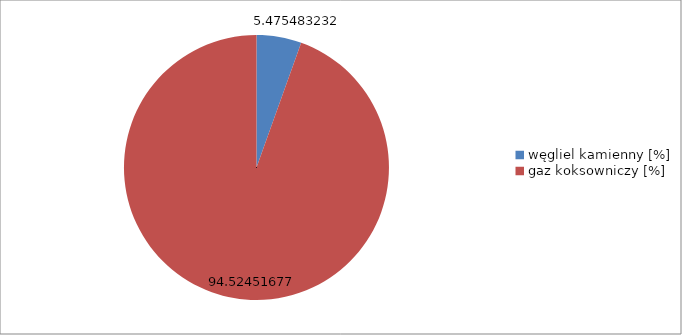
| Category | Series 0 |
|---|---|
| węgliel kamienny [%] | 5.475 |
| gaz koksowniczy [%] | 94.525 |